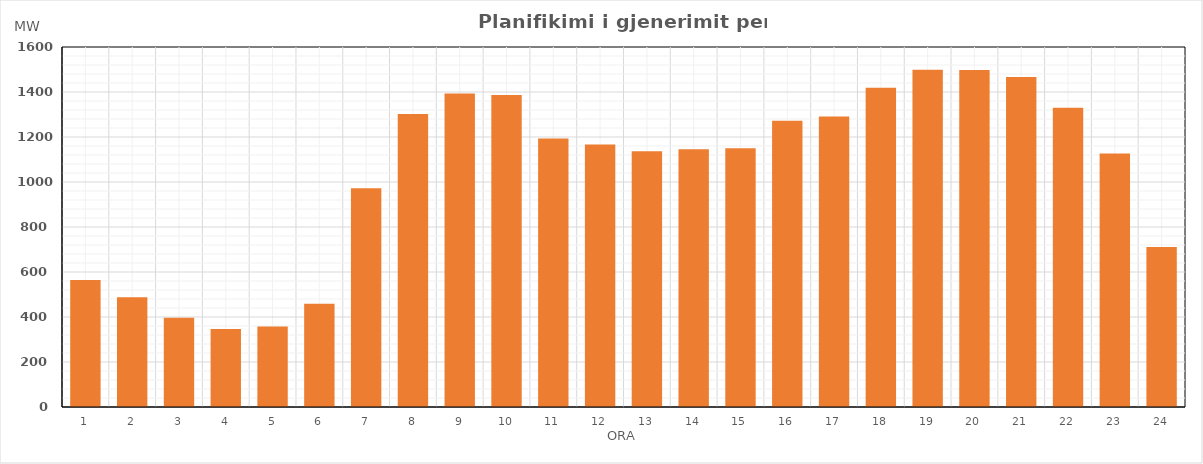
| Category | Max (MW) |
|---|---|
| 0 | 563.971 |
| 1 | 487.45 |
| 2 | 396.2 |
| 3 | 346.735 |
| 4 | 357.965 |
| 5 | 459.4 |
| 6 | 972.695 |
| 7 | 1302.09 |
| 8 | 1393.615 |
| 9 | 1386.535 |
| 10 | 1193.395 |
| 11 | 1166.345 |
| 12 | 1136.21 |
| 13 | 1145.28 |
| 14 | 1150.225 |
| 15 | 1272.125 |
| 16 | 1291.15 |
| 17 | 1418.6 |
| 18 | 1499.25 |
| 19 | 1497.27 |
| 20 | 1466.145 |
| 21 | 1329.56 |
| 22 | 1126.726 |
| 23 | 710.61 |